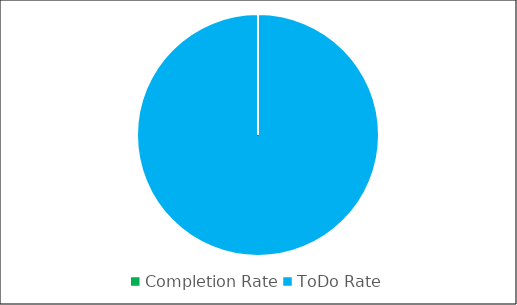
| Category | Series 0 |
|---|---|
| Completion Rate | 0 |
| ToDo Rate | 100 |